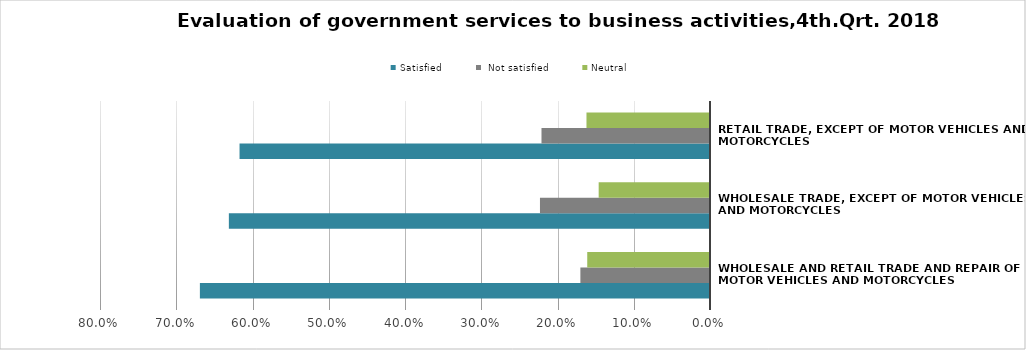
| Category | Satisfied |  Not satisfied | Neutral |
|---|---|---|---|
| Wholesale and retail trade and repair of motor vehicles and motorcycles | 0.669 | 0.17 | 0.161 |
| Wholesale trade, except of motor vehicles and motorcycles | 0.631 | 0.223 | 0.146 |
| Retail trade, except of motor vehicles and motorcycles | 0.617 | 0.221 | 0.162 |